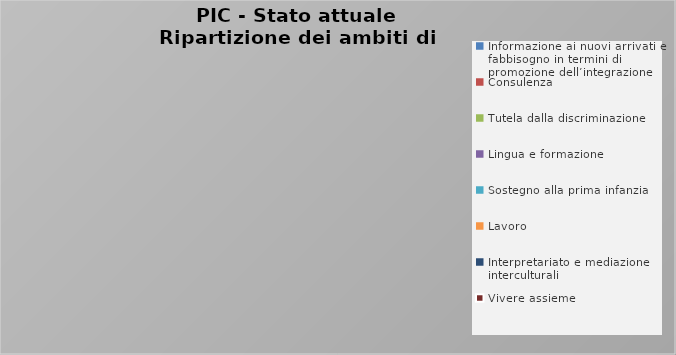
| Category | Totale |
|---|---|
| Informazione ai nuovi arrivati e fabbisogno in termini di promozione dell’integrazione | 0 |
| Consulenza | 0 |
| Tutela dalla discriminazione | 0 |
| Lingua e formazione | 0 |
| Sostegno alla prima infanzia | 0 |
| Lavoro | 0 |
| Interpretariato e mediazione interculturali | 0 |
| Vivere assieme | 0 |